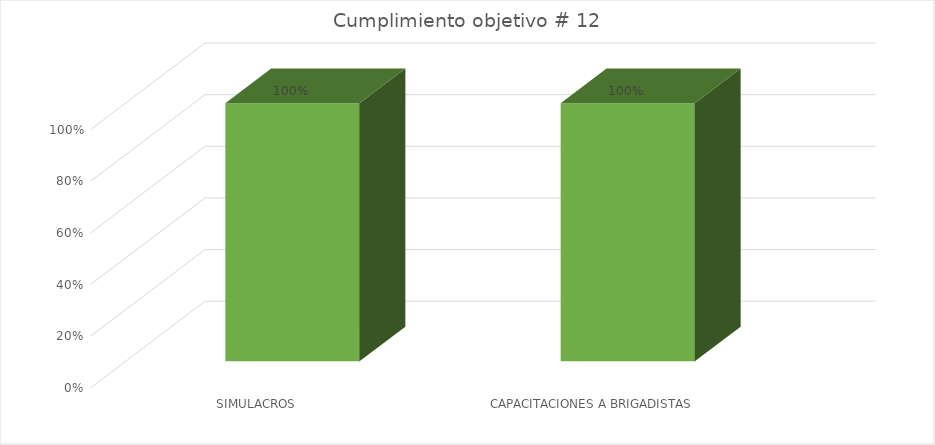
| Category | Series 0 |
|---|---|
| SIMULACROS | 1 |
| CAPACITACIONES A BRIGADISTAS | 1 |